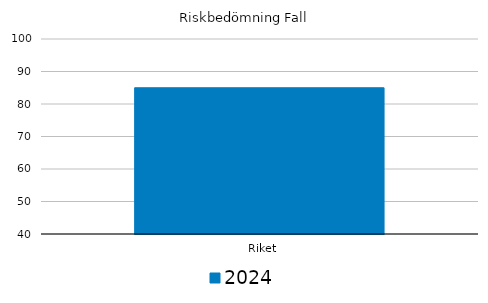
| Category | 2024 |
|---|---|
|   Riket | 85 |